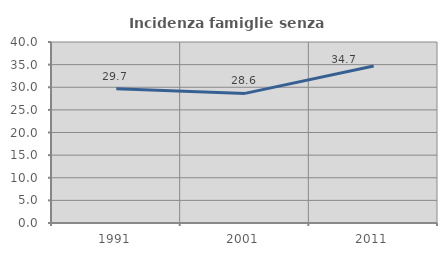
| Category | Incidenza famiglie senza nuclei |
|---|---|
| 1991.0 | 29.68 |
| 2001.0 | 28.639 |
| 2011.0 | 34.681 |